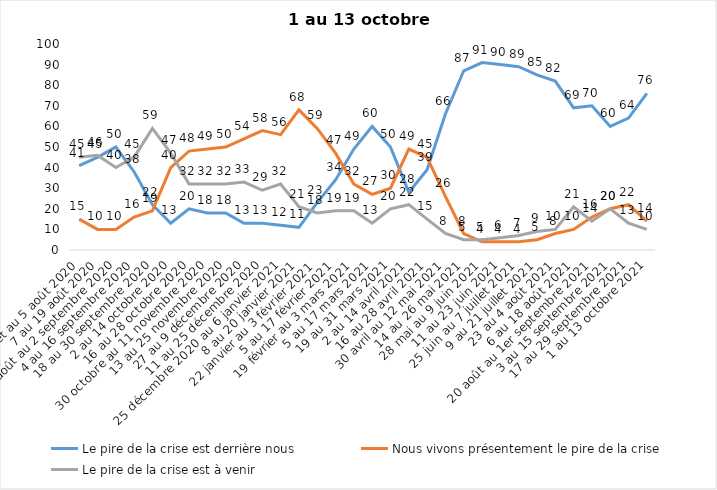
| Category | Le pire de la crise est derrière nous | Nous vivons présentement le pire de la crise | Le pire de la crise est à venir |
|---|---|---|---|
| 24 juillet au 5 août 2020 | 41 | 15 | 45 |
| 7 au 19 août 2020 | 45 | 10 | 46 |
| 21 août au 2 septembre 2020 | 50 | 10 | 40 |
| 4 au 16 septembre 2020 | 38 | 16 | 45 |
| 18 au 30 septembre 2020 | 22 | 19 | 59 |
| 2 au 14 octobre 2020 | 13 | 40 | 47 |
| 16 au 28 octobre 2020 | 20 | 48 | 32 |
| 30 octobre au 11 novembre 2020 | 18 | 49 | 32 |
| 13 au 25 novembre 2020 | 18 | 50 | 32 |
| 27 au 9 décembre 2020 | 13 | 54 | 33 |
| 11 au 25 décembre 2020 | 13 | 58 | 29 |
| 25 décembre 2020 au 6 janvier 2021 | 12 | 56 | 32 |
| 8 au 20 janvier 2021 | 11 | 68 | 21 |
| 22 janvier au 3 février 2021 | 23 | 59 | 18 |
| 5 au 17 février 2021 | 34 | 47 | 19 |
| 19 février au 3 mars 2021 | 49 | 32 | 19 |
| 5 au 17 mars 2021 | 60 | 27 | 13 |
| 19 au 31 mars 2021 | 50 | 30 | 20 |
| 2 au 14 avril 2021 | 28 | 49 | 22 |
| 16 au 28 avril 2021 | 39 | 45 | 15 |
| 30 avril au 12 mai 2021 | 66 | 26 | 8 |
| 14 au 26 mai 2021 | 87 | 8 | 5 |
| 28 mai au 9 juin 2021 | 91 | 4 | 5 |
| 11 au 23 juin 2021 | 90 | 4 | 6 |
| 25 juin au 7 juillet 2021 | 89 | 4 | 7 |
| 9 au 21 juillet 2021 | 85 | 5 | 9 |
| 23 au 4 août 2021 | 82 | 8 | 10 |
| 6 au 18 août 2021 | 69 | 10 | 21 |
| 20 août au 1er septembre 2021 | 70 | 16 | 14 |
| 3 au 15 septembre 2021 | 60 | 20 | 20 |
| 17 au 29 septembre 2021 | 64 | 22 | 13 |
| 1 au 13 octobre 2021 | 76 | 14 | 10 |